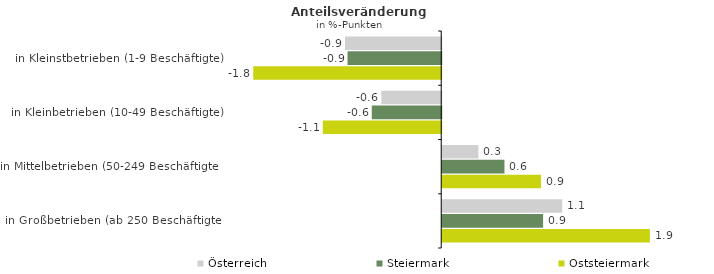
| Category | Österreich | Steiermark | Oststeiermark |
|---|---|---|---|
| in Kleinstbetrieben (1-9 Beschäftigte) | -0.898 | -0.875 | -1.755 |
| in Kleinbetrieben (10-49 Beschäftigte) | -0.559 | -0.648 | -1.106 |
| in Mittelbetrieben (50-249 Beschäftigte) | 0.338 | 0.581 | 0.923 |
| in Großbetrieben (ab 250 Beschäftigte) | 1.12 | 0.942 | 1.939 |